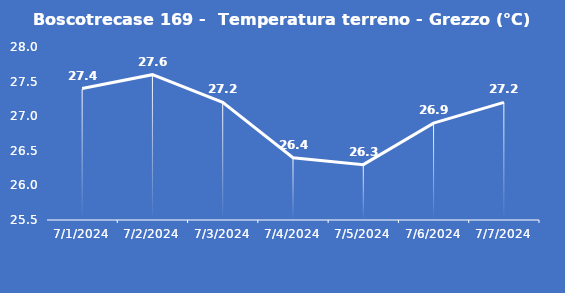
| Category | Boscotrecase 169 -  Temperatura terreno - Grezzo (°C) |
|---|---|
| 7/1/24 | 27.4 |
| 7/2/24 | 27.6 |
| 7/3/24 | 27.2 |
| 7/4/24 | 26.4 |
| 7/5/24 | 26.3 |
| 7/6/24 | 26.9 |
| 7/7/24 | 27.2 |